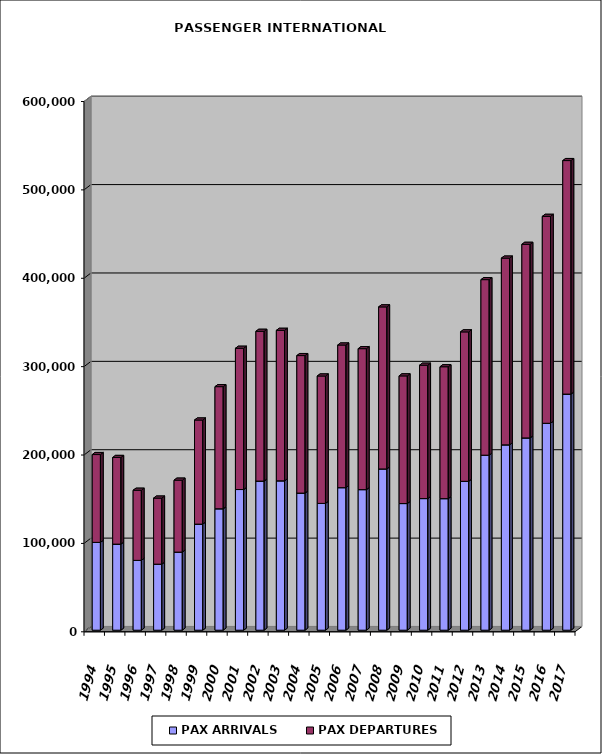
| Category | PAX ARRIVALS | PAX DEPARTURES |
|---|---|---|
| 1994.0 | 99379 | 99359 |
| 1995.0 | 97393 | 98054 |
| 1996.0 | 79006 | 79343 |
| 1997.0 | 74726 | 74735 |
| 1998.0 | 88367 | 81382 |
| 1999.0 | 120036 | 117768 |
| 2000.0 | 137392 | 138177 |
| 2001.0 | 159166 | 159814 |
| 2002.0 | 168728 | 169440 |
| 2003.0 | 169027 | 170245 |
| 2004.0 | 155136 | 155581 |
| 2005.0 | 143467 | 144154 |
| 2006.0 | 161287 | 161375 |
| 2007.0 | 159069 | 159481 |
| 2008.0 | 182481 | 183332 |
| 2009.0 | 143298 | 144461 |
| 2010.0 | 148935 | 150889 |
| 2011.0 | 148858 | 149230 |
| 2012.0 | 168496 | 169047 |
| 2013.0 | 198033 | 198630 |
| 2014.0 | 209725 | 211264 |
| 2015.0 | 217567 | 219020 |
| 2016.0 | 234131 | 234112 |
| 2017.0 | 267160 | 264211 |